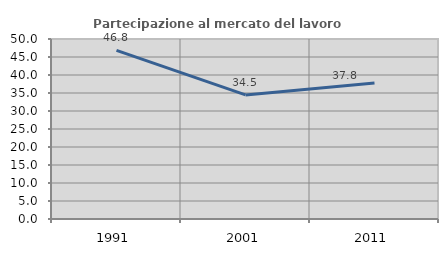
| Category | Partecipazione al mercato del lavoro  femminile |
|---|---|
| 1991.0 | 46.842 |
| 2001.0 | 34.476 |
| 2011.0 | 37.787 |